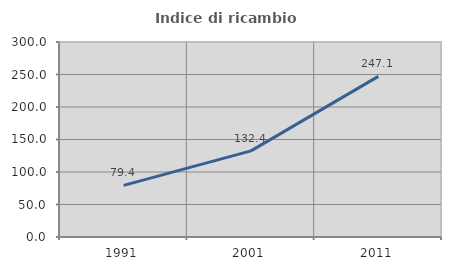
| Category | Indice di ricambio occupazionale  |
|---|---|
| 1991.0 | 79.439 |
| 2001.0 | 132.432 |
| 2011.0 | 247.059 |